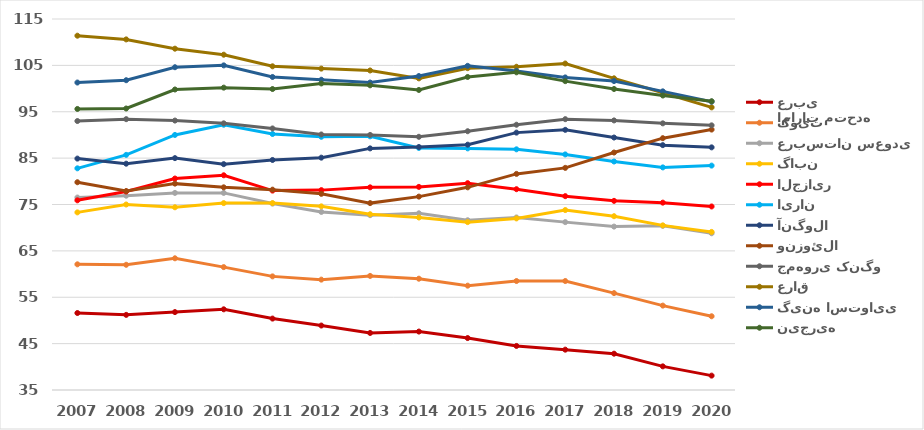
| Category | امارات متحده عربی | کویت | عربستان سعودی | گابن | الجزایر | ایران | آنگولا | ونزوئلا | جمهوری کنگو | عراق | گینه استوایی | نیجریه |
|---|---|---|---|---|---|---|---|---|---|---|---|---|
| 2007.0 | 51.6 | 62.1 | 76.5 | 73.3 | 75.9 | 82.8 | 84.9 | 79.8 | 93 | 111.4 | 101.3 | 95.6 |
| 2008.0 | 51.2 | 62 | 76.9 | 75 | 77.8 | 85.7 | 83.8 | 77.9 | 93.4 | 110.6 | 101.8 | 95.7 |
| 2009.0 | 51.8 | 63.4 | 77.5 | 74.4 | 80.6 | 90 | 85 | 79.5 | 93.1 | 108.6 | 104.6 | 99.8 |
| 2010.0 | 52.4 | 61.5 | 77.5 | 75.3 | 81.3 | 92.2 | 83.7 | 78.7 | 92.5 | 107.3 | 105 | 100.2 |
| 2011.0 | 50.4 | 59.5 | 75.2 | 75.3 | 78 | 90.2 | 84.6 | 78.2 | 91.4 | 104.8 | 102.5 | 99.9 |
| 2012.0 | 48.9 | 58.8 | 73.4 | 74.6 | 78.1 | 89.6 | 85.1 | 77.3 | 90.1 | 104.3 | 101.9 | 101.1 |
| 2013.0 | 47.3 | 59.6 | 72.7 | 72.9 | 78.7 | 89.7 | 87.1 | 75.3 | 90 | 103.9 | 101.3 | 100.7 |
| 2014.0 | 47.6 | 59 | 73.1 | 72.2 | 78.8 | 87.2 | 87.4 | 76.7 | 89.6 | 102.2 | 102.7 | 99.7 |
| 2015.0 | 46.2 | 57.5 | 71.6 | 71.2 | 79.6 | 87.1 | 87.9 | 78.7 | 90.8 | 104.4 | 104.9 | 102.5 |
| 2016.0 | 44.5 | 58.5 | 72.2 | 72 | 78.3 | 86.9 | 90.5 | 81.6 | 92.2 | 104.7 | 103.8 | 103.5 |
| 2017.0 | 43.7 | 58.5 | 71.2 | 73.8 | 76.8 | 85.8 | 91.1 | 82.9 | 93.4 | 105.4 | 102.4 | 101.6 |
| 2018.0 | 42.829 | 55.891 | 70.235 | 72.476 | 75.785 | 84.271 | 89.44 | 86.207 | 93.128 | 102.206 | 101.617 | 99.908 |
| 2019.0 | 40.1 | 53.2 | 70.4 | 70.5 | 75.4 | 83 | 87.8 | 89.3 | 92.5 | 99.1 | 99.4 | 98.5 |
| 2020.0 | 38.099 | 50.899 | 68.8 | 69.087 | 74.575 | 83.387 | 87.32 | 91.158 | 92.068 | 95.941 | 97.168 | 97.268 |